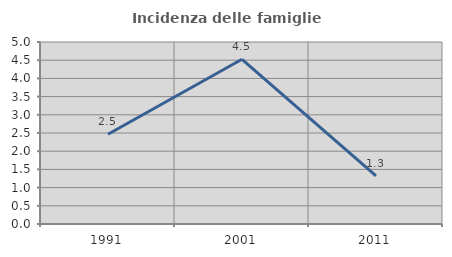
| Category | Incidenza delle famiglie numerose |
|---|---|
| 1991.0 | 2.464 |
| 2001.0 | 4.526 |
| 2011.0 | 1.322 |